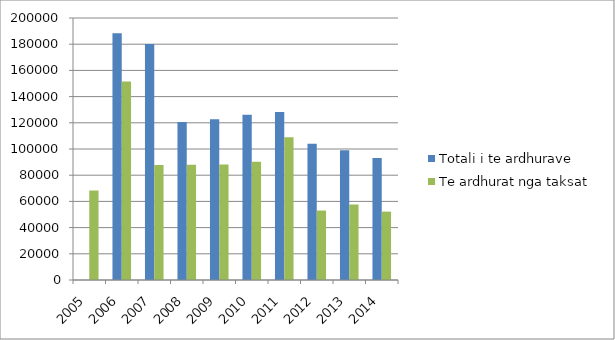
| Category | Totali i te ardhurave  | Te ardhurat nga taksat  |
|---|---|---|
| 2005.0 | 0 | 68333 |
| 2006.0 | 188279 | 151524 |
| 2007.0 | 180216 | 87707 |
| 2008.0 | 120516 | 87943 |
| 2009.0 | 122711 | 88200 |
| 2010.0 | 126203 | 90350 |
| 2011.0 | 128206 | 108904 |
| 2012.0 | 104081 | 53045 |
| 2013.0 | 99051 | 57645 |
| 2014.0 | 93187 | 52193 |